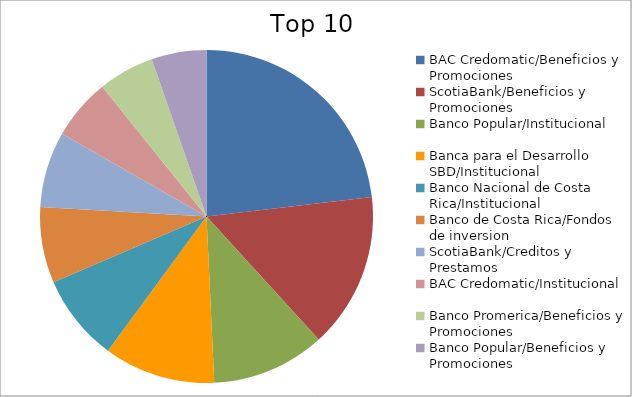
| Category | Series 0 |
|---|---|
| BAC Credomatic/Beneficios y Promociones | 18.88 |
| ScotiaBank/Beneficios y Promociones | 12.31 |
| Banco Popular/Institucional | 9 |
| Banca para el Desarrollo SBD/Institucional | 8.83 |
| Banco Nacional de Costa Rica/Institucional | 6.9 |
| Banco de Costa Rica/Fondos de inversion | 6.02 |
| ScotiaBank/Creditos y Prestamos | 6 |
| BAC Credomatic/Institucional | 4.87 |
| Banco Promerica/Beneficios y Promociones | 4.43 |
| Banco Popular/Beneficios y Promociones | 4.35 |